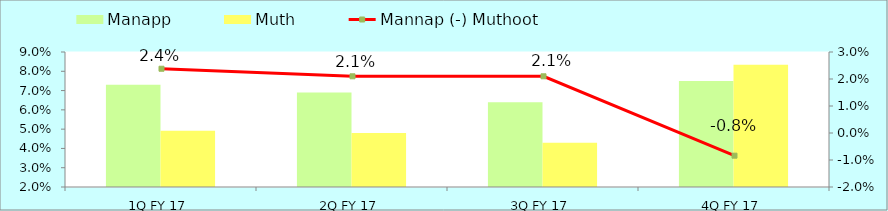
| Category | Manapp | Muth |
|---|---|---|
| 1Q FY 17 | 0.073 | 0.049 |
| 2Q FY 17 | 0.069 | 0.048 |
| 3Q FY 17 | 0.064 | 0.043 |
| 4Q FY 17 | 0.075 | 0.083 |